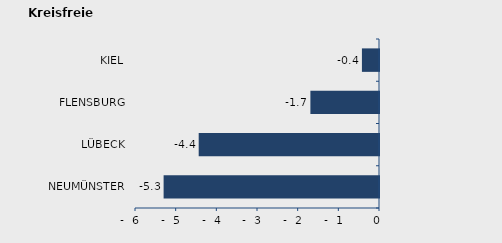
| Category | Überschuss der Geborenen (+) bzw. Gestorbenen (-) |
|---|---|
| NEUMÜNSTER | -5.296 |
| LÜBECK | -4.434 |
| FLENSBURG | -1.687 |
| KIEL | -0.42 |